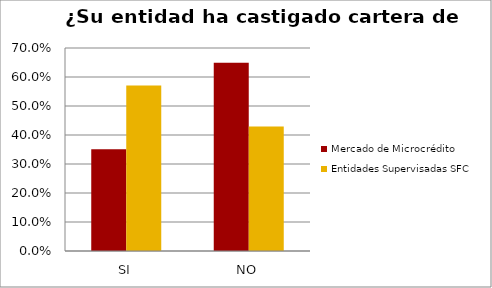
| Category | Mercado de Microcrédito | Entidades Supervisadas SFC |
|---|---|---|
| SI | 0.351 | 0.571 |
| NO | 0.649 | 0.429 |